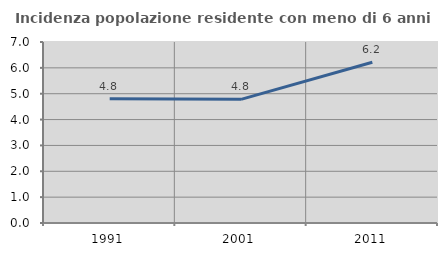
| Category | Incidenza popolazione residente con meno di 6 anni |
|---|---|
| 1991.0 | 4.802 |
| 2001.0 | 4.781 |
| 2011.0 | 6.219 |